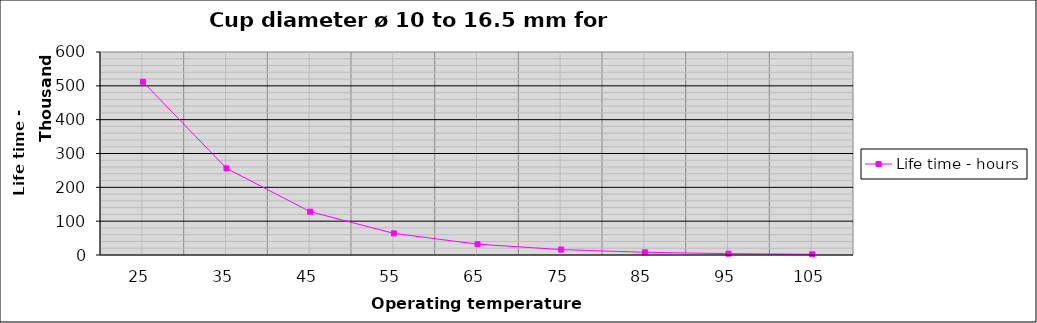
| Category | Life time - hours |
|---|---|
| 25.0 | 512000 |
| 35.0 | 256000 |
| 45.0 | 128000 |
| 55.0 | 64000 |
| 65.0 | 32000 |
| 75.0 | 16000 |
| 85.0 | 8000 |
| 95.0 | 4000 |
| 105.0 | 2000 |